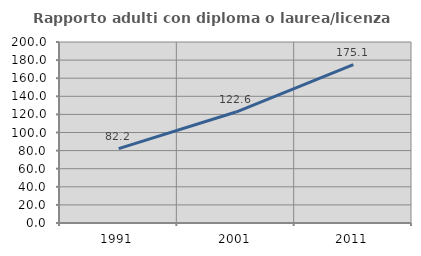
| Category | Rapporto adulti con diploma o laurea/licenza media  |
|---|---|
| 1991.0 | 82.233 |
| 2001.0 | 122.625 |
| 2011.0 | 175.06 |